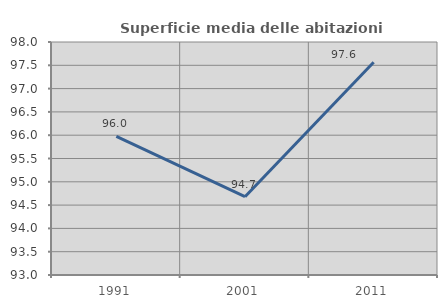
| Category | Superficie media delle abitazioni occupate |
|---|---|
| 1991.0 | 95.975 |
| 2001.0 | 94.681 |
| 2011.0 | 97.567 |